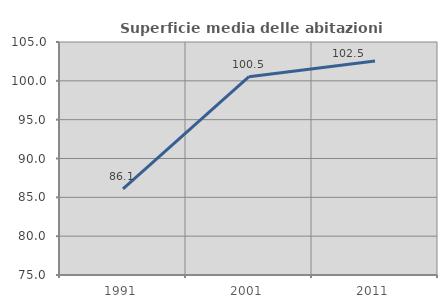
| Category | Superficie media delle abitazioni occupate |
|---|---|
| 1991.0 | 86.08 |
| 2001.0 | 100.538 |
| 2011.0 | 102.548 |